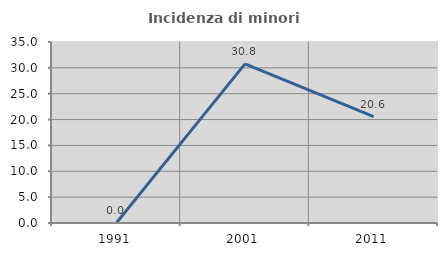
| Category | Incidenza di minori stranieri |
|---|---|
| 1991.0 | 0 |
| 2001.0 | 30.769 |
| 2011.0 | 20.561 |